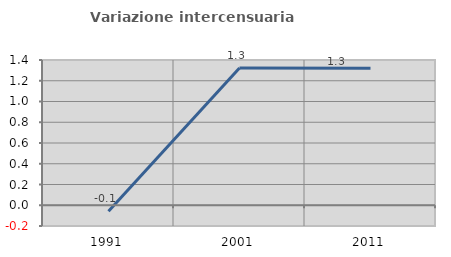
| Category | Variazione intercensuaria annua |
|---|---|
| 1991.0 | -0.058 |
| 2001.0 | 1.322 |
| 2011.0 | 1.32 |